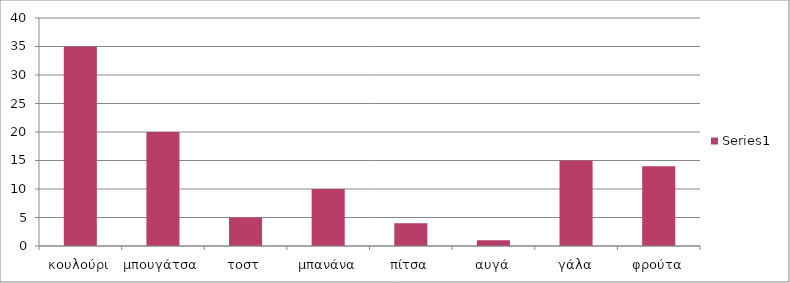
| Category | Series 0 |
|---|---|
| κουλούρι | 35 |
| μπουγάτσα | 20 |
| τοστ | 5 |
| μπανάνα | 10 |
| πίτσα | 4 |
| αυγά | 1 |
| γάλα | 15 |
| φρούτα | 14 |